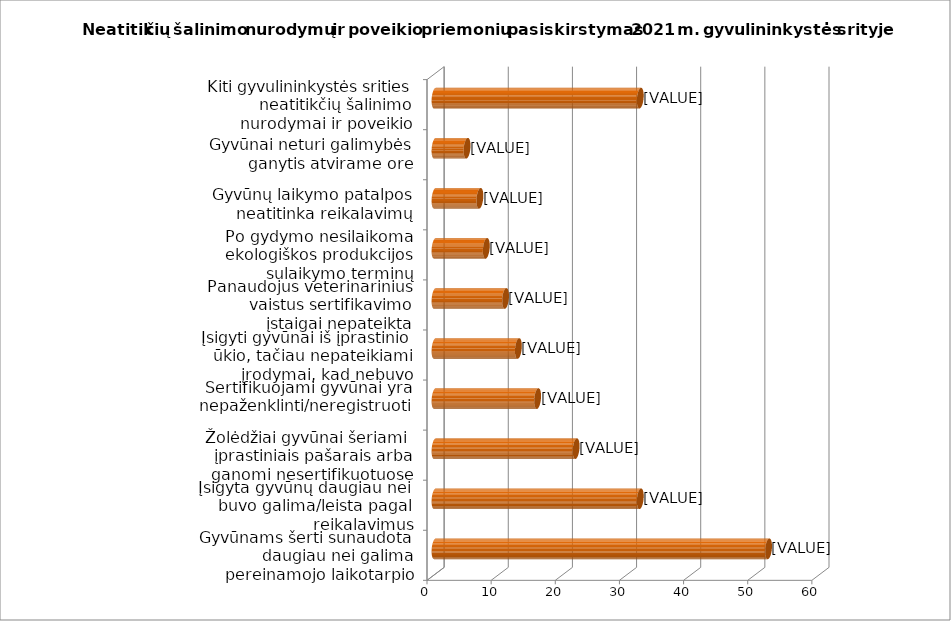
| Category | 2021 m  |
|---|---|
| Gyvūnams šerti sunaudota daugiau nei galima pereinamojo laikotarpio pašarų | 52 |
| Įsigyta gyvūnų daugiau nei buvo galima/leista pagal reikalavimus | 32 |
| Žolėdžiai gyvūnai šeriami  įprastiniais pašarais arba ganomi nesertifikuotuose plotuose  | 22 |
| Sertifikuojami gyvūnai yra nepaženklinti/neregistruoti | 16 |
| Įsigyti gyvūnai iš įprastinio ūkio, tačiau nepateikiami įrodymai, kad nebuvo ekologiškų | 13 |
| Panaudojus veterinarinius vaistus sertifikavimo įstaigai nepateikta informacija  | 11 |
| Po gydymo nesilaikoma ekologiškos produkcijos sulaikymo terminų (išlaukos) | 8 |
| Gyvūnų laikymo patalpos neatitinka reikalavimų | 7 |
| Gyvūnai neturi galimybės ganytis atvirame ore | 5 |
| Kiti gyvulininkystės srities neatitikčių šalinimo nurodymai ir poveikio priemonės | 32 |